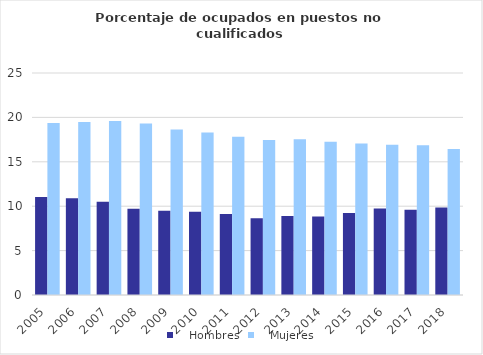
| Category |    Hombres |    Mujeres |
|---|---|---|
| 2005.0 | 11.036 | 19.361 |
| 2006.0 | 10.884 | 19.47 |
| 2007.0 | 10.488 | 19.593 |
| 2008.0 | 9.699 | 19.306 |
| 2009.0 | 9.502 | 18.644 |
| 2010.0 | 9.363 | 18.293 |
| 2011.0 | 9.125 | 17.832 |
| 2012.0 | 8.648 | 17.458 |
| 2013.0 | 8.885 | 17.544 |
| 2014.0 | 8.829 | 17.269 |
| 2015.0 | 9.225 | 17.048 |
| 2016.0 | 9.742 | 16.932 |
| 2017.0 | 9.606 | 16.856 |
| 2018.0 | 9.861 | 16.433 |